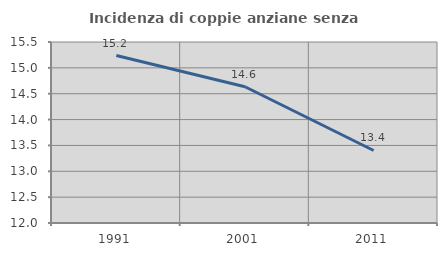
| Category | Incidenza di coppie anziane senza figli  |
|---|---|
| 1991.0 | 15.238 |
| 2001.0 | 14.634 |
| 2011.0 | 13.402 |